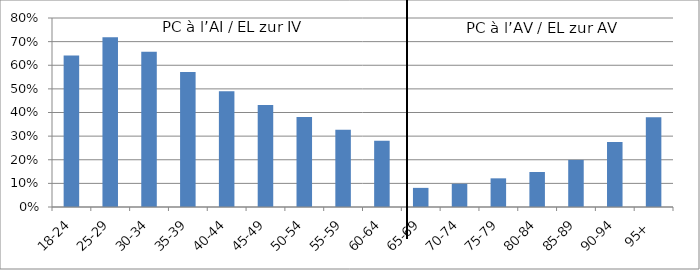
| Category | PC à l’AI / EL zur IV PC à l’AV / EL zur AV |
|---|---|
| 18-24 | 0.641 |
| 25-29 | 0.719 |
| 30-34 | 0.657 |
| 35-39 | 0.572 |
| 40-44 | 0.49 |
| 45-49 | 0.432 |
| 50-54 | 0.381 |
| 55-59 | 0.327 |
| 60-64 | 0.28 |
| 65-69 | 0.081 |
| 70-74 | 0.098 |
| 75-79 | 0.121 |
| 80-84 | 0.148 |
| 85-89 | 0.199 |
| 90-94 | 0.275 |
| 95+ | 0.38 |